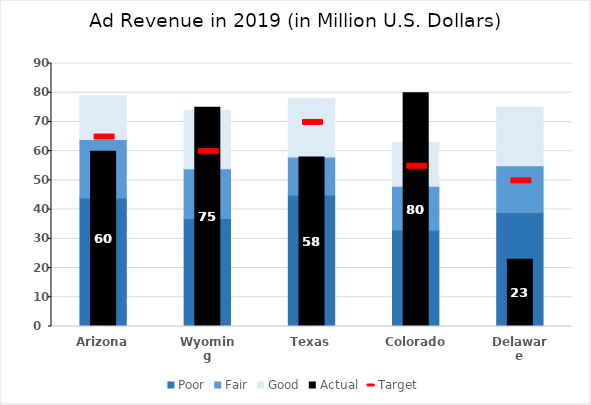
| Category | Poor | Fair | Good |
|---|---|---|---|
| Arizona | 44 | 20 | 15 |
| Wyoming | 37 | 17 | 20 |
| Texas | 45 | 13 | 20 |
| Colorado | 33 | 15 | 15 |
| Delaware | 39 | 16 | 20 |